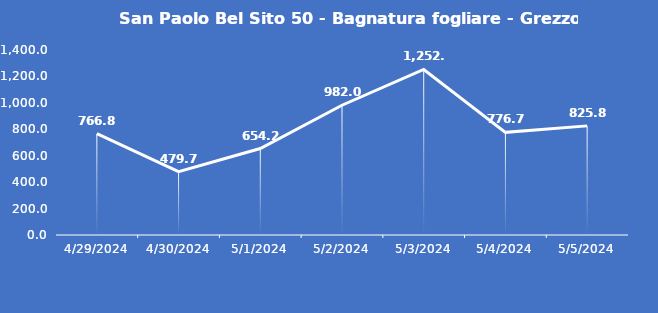
| Category | San Paolo Bel Sito 50 - Bagnatura fogliare - Grezzo (min) |
|---|---|
| 4/29/24 | 766.8 |
| 4/30/24 | 479.7 |
| 5/1/24 | 654.2 |
| 5/2/24 | 982 |
| 5/3/24 | 1252.9 |
| 5/4/24 | 776.7 |
| 5/5/24 | 825.8 |